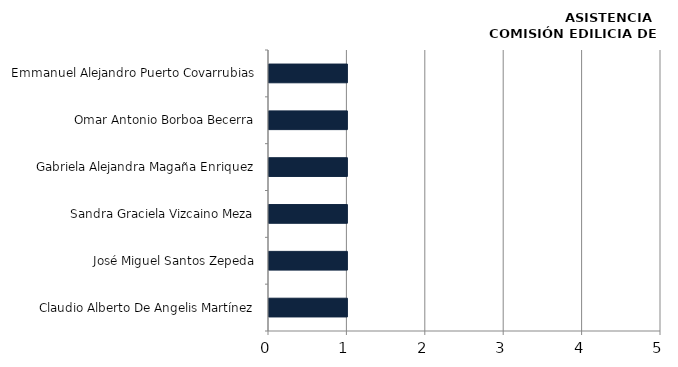
| Category | Series 0 |
|---|---|
| Claudio Alberto De Angelis Martínez | 1 |
| José Miguel Santos Zepeda | 1 |
| Sandra Graciela Vizcaino Meza | 1 |
| Gabriela Alejandra Magaña Enriquez | 1 |
| Omar Antonio Borboa Becerra | 1 |
| Emmanuel Alejandro Puerto Covarrubias | 1 |